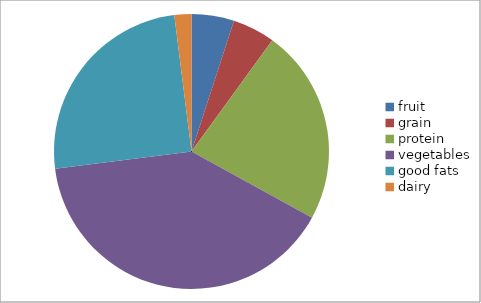
| Category | Series 0 |
|---|---|
| fruit | 5 |
| grain | 5 |
| protein | 23 |
| vegetables | 40 |
| good fats | 25 |
| dairy | 2 |